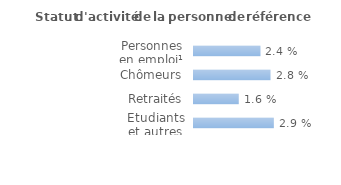
| Category | Series 0 |
|---|---|
| Personnes en emploi¹ | 0.024 |
| Chômeurs | 0.028 |
| Retraités | 0.016 |
| Etudiants et autres inactifs | 0.029 |